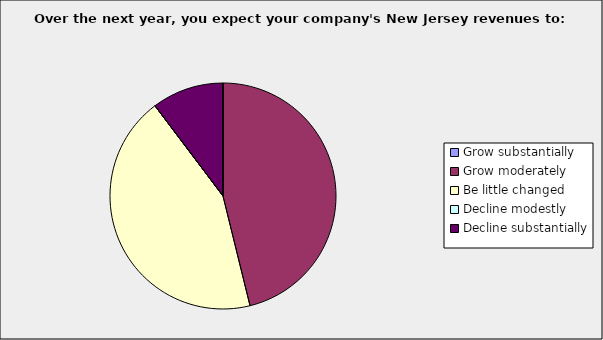
| Category | Series 0 |
|---|---|
| Grow substantially | 0 |
| Grow moderately | 0.462 |
| Be little changed | 0.436 |
| Decline modestly | 0 |
| Decline substantially | 0.103 |